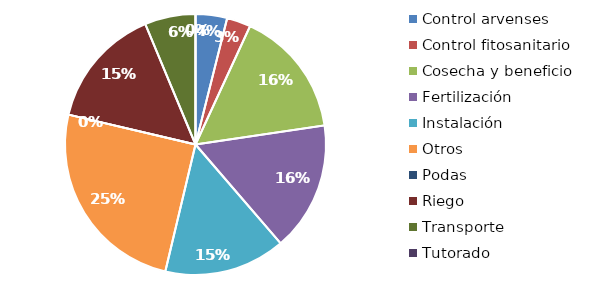
| Category | Valor |
|---|---|
| Control arvenses | 687680 |
| Control fitosanitario | 521728 |
| Cosecha y beneficio | 2777963.855 |
| Fertilización | 2820000 |
| Instalación | 2645679.862 |
| Otros | 4391792 |
| Podas | 0 |
| Riego | 2645600 |
| Transporte | 1106774 |
| Tutorado | 0 |